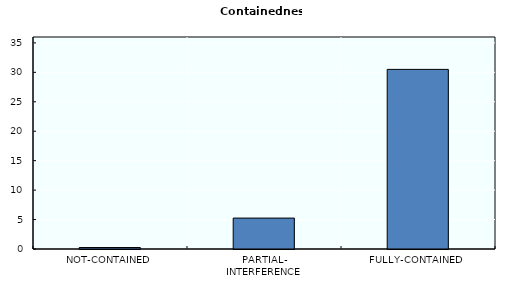
| Category | Containedness |
|---|---|
| NOT-CONTAINED | 0.25 |
| PARTIAL-
INTERFERENCE | 5.25 |
| FULLY-CONTAINED | 30.5 |